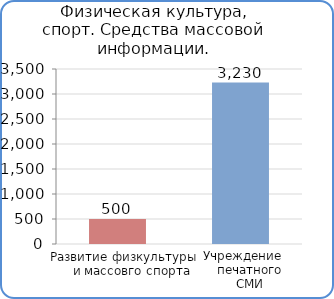
| Category | Расходы |
|---|---|
| Развитие физической культуры и массового спорта | 500000 |
| Учреждение печатного СМИ  | 3230000 |